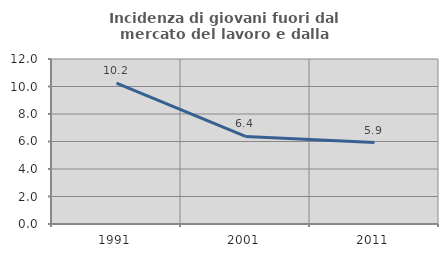
| Category | Incidenza di giovani fuori dal mercato del lavoro e dalla formazione  |
|---|---|
| 1991.0 | 10.246 |
| 2001.0 | 6.369 |
| 2011.0 | 5.926 |